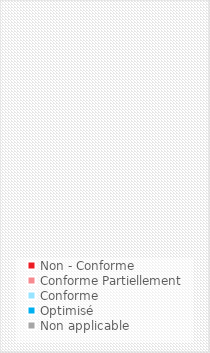
| Category | Series 0 |
|---|---|
| Non - Conforme | 0 |
| Conforme Partiellement  | 0 |
| Conforme | 0 |
| Optimisé | 0 |
| Non applicable | 0 |